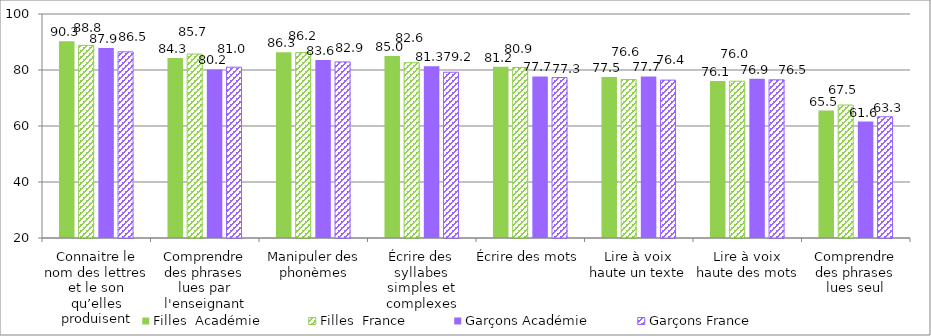
| Category | Filles  | Garçons |
|---|---|---|
| Connaitre le nom des lettres et le son qu’elles produisent | 88.8 | 86.5 |
| Comprendre des phrases lues par l'enseignant | 85.7 | 81 |
| Manipuler des phonèmes | 86.2 | 82.9 |
| Écrire des syllabes simples et complexes | 82.6 | 79.2 |
| Écrire des mots | 80.9 | 77.3 |
| Lire à voix haute un texte | 76.6 | 76.4 |
| Lire à voix haute des mots | 76 | 76.5 |
| Comprendre des phrases lues seul | 67.5 | 63.3 |